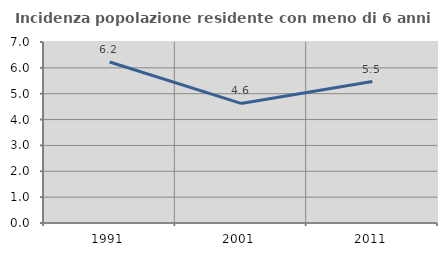
| Category | Incidenza popolazione residente con meno di 6 anni |
|---|---|
| 1991.0 | 6.227 |
| 2001.0 | 4.624 |
| 2011.0 | 5.47 |